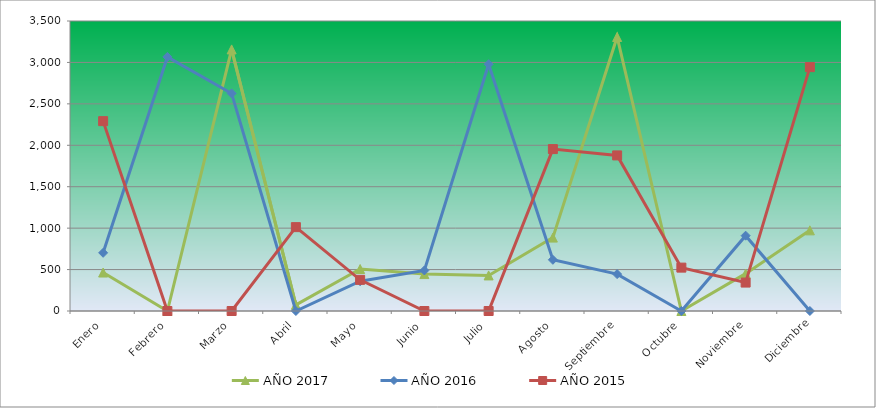
| Category | AÑO 2017 | AÑO 2016 | AÑO 2015 |
|---|---|---|---|
| Enero | 464.243 | 702.098 | 2291.56 |
| Febrero | 0 | 3066.596 | 0 |
| Marzo | 3157.078 | 2625.989 | 0 |
| Abril | 73.63 | 0 | 1012.106 |
| Mayo | 506.674 | 359.388 | 375.918 |
| Junio | 445.524 | 489.272 | 0 |
| Julio | 429.3 | 2977.899 | 0 |
| Agosto | 886.056 | 617.895 | 1954.191 |
| Septiembre | 3307.13 | 445.136 | 1877.806 |
| Octubre | 0 | 0 | 523.509 |
| Noviembre | 450.516 | 909.188 | 343.119 |
| Diciembre | 973.414 | 0 | 2943.192 |